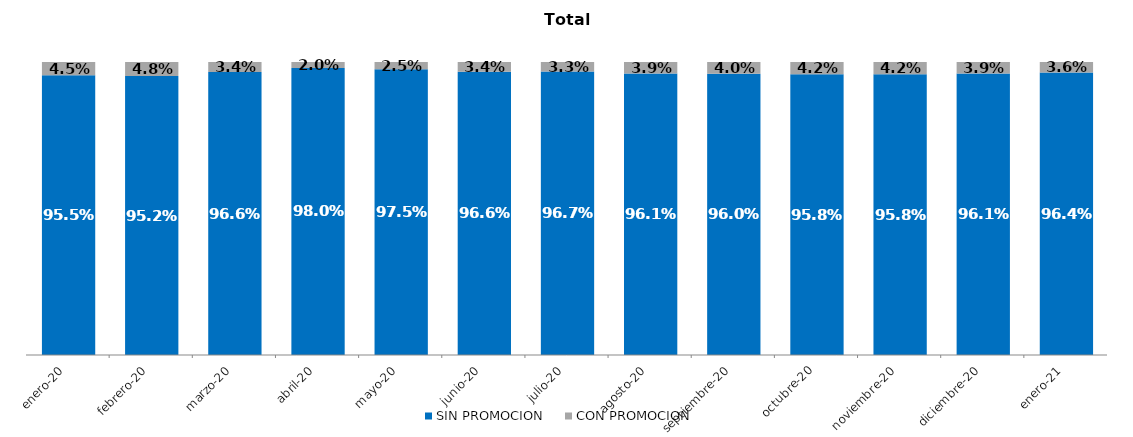
| Category | SIN PROMOCION   | CON PROMOCION   |
|---|---|---|
| 2020-01-01 | 0.955 | 0.045 |
| 2020-02-01 | 0.952 | 0.048 |
| 2020-03-01 | 0.966 | 0.034 |
| 2020-04-01 | 0.98 | 0.02 |
| 2020-05-01 | 0.975 | 0.025 |
| 2020-06-01 | 0.966 | 0.034 |
| 2020-07-01 | 0.967 | 0.033 |
| 2020-08-01 | 0.961 | 0.039 |
| 2020-09-01 | 0.96 | 0.04 |
| 2020-10-01 | 0.958 | 0.042 |
| 2020-11-01 | 0.958 | 0.042 |
| 2020-12-01 | 0.961 | 0.039 |
| 2021-01-01 | 0.964 | 0.036 |